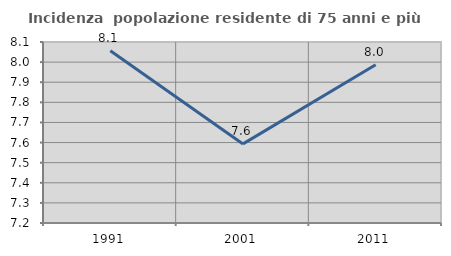
| Category | Incidenza  popolazione residente di 75 anni e più |
|---|---|
| 1991.0 | 8.057 |
| 2001.0 | 7.593 |
| 2011.0 | 7.987 |